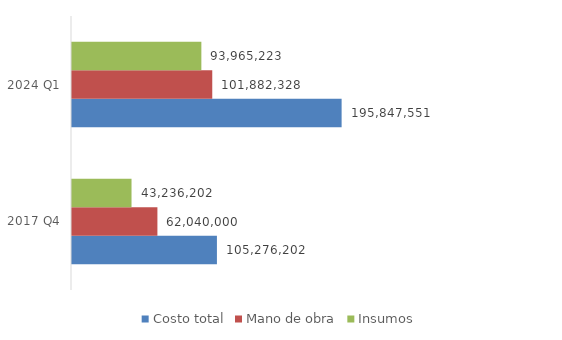
| Category | Costo total | Mano de obra | Insumos |
|---|---|---|---|
| 2017 Q4 | 105276202 | 62040000 | 43236202 |
| 2024 Q1 | 195847550.653 | 101882328 | 93965222.653 |